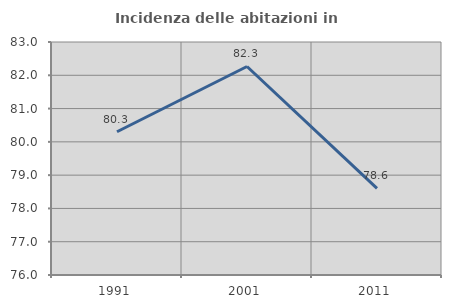
| Category | Incidenza delle abitazioni in proprietà  |
|---|---|
| 1991.0 | 80.303 |
| 2001.0 | 82.265 |
| 2011.0 | 78.603 |